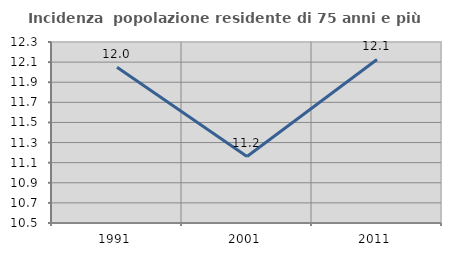
| Category | Incidenza  popolazione residente di 75 anni e più |
|---|---|
| 1991.0 | 12.048 |
| 2001.0 | 11.162 |
| 2011.0 | 12.126 |